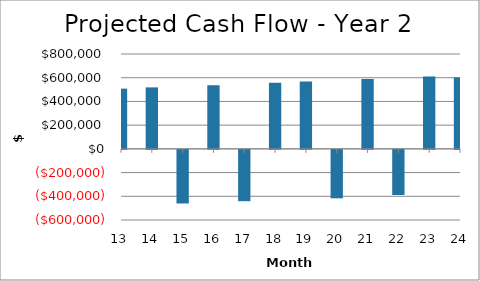
| Category | Year 2 |
|---|---|
| 13.0 | 507797.713 |
| 14.0 | 518460.181 |
| 15.0 | -452207.635 |
| 16.0 | 537331.829 |
| 17.0 | -432913.278 |
| 18.0 | 557065.63 |
| 19.0 | 567277.606 |
| 20.0 | -408500.076 |
| 21.0 | 588426.985 |
| 22.0 | -380602.483 |
| 23.0 | 610642.546 |
| 24.0 | 602541.704 |